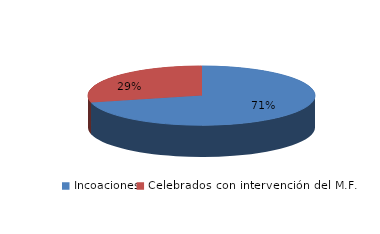
| Category | Series 0 |
|---|---|
| Incoaciones | 6160 |
| Celebrados con intervención del M.F. | 2488 |